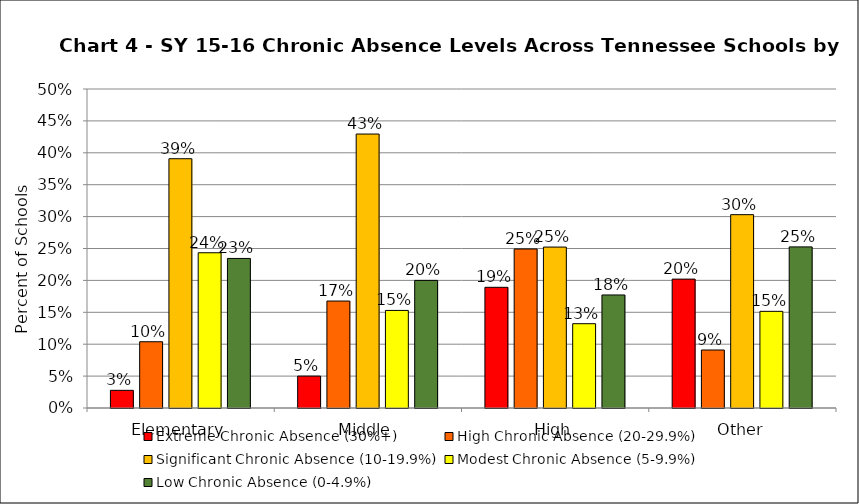
| Category | Extreme Chronic Absence (30%+) | High Chronic Absence (20-29.9%) | Significant Chronic Absence (10-19.9%) | Modest Chronic Absence (5-9.9%) | Low Chronic Absence (0-4.9%) |
|---|---|---|---|---|---|
| 0 | 0.028 | 0.104 | 0.391 | 0.243 | 0.234 |
| 1 | 0.05 | 0.168 | 0.429 | 0.153 | 0.2 |
| 2 | 0.189 | 0.249 | 0.252 | 0.132 | 0.177 |
| 3 | 0.202 | 0.091 | 0.303 | 0.152 | 0.253 |